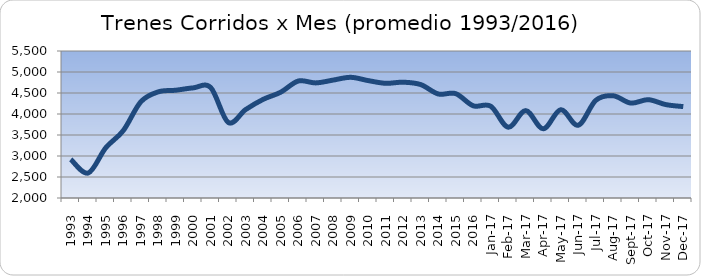
| Category | Series 0 |
|---|---|
| 1993.0 | 2920.333 |
| 1994.0 | 2595.583 |
| 1995.0 | 3195.667 |
| 1996.0 | 3603.833 |
| 1997.0 | 4288.5 |
| 1998.0 | 4527.083 |
| 1999.0 | 4565.833 |
| 2000.0 | 4622.417 |
| 2001.0 | 4628.417 |
| 2002.0 | 3798.583 |
| 2003.0 | 4107.25 |
| 2004.0 | 4349.667 |
| 2005.0 | 4519.333 |
| 2006.0 | 4785.083 |
| 2007.0 | 4740.333 |
| 2008.0 | 4808 |
| 2009.0 | 4873.333 |
| 2010.0 | 4795 |
| 2011.0 | 4730.667 |
| 2012.0 | 4757.167 |
| 2013.0 | 4700.167 |
| 2014.0 | 4477 |
| 2015.0 | 4484.25 |
| 2016.0 | 4194.917 |
| 42736.0 | 4185 |
| 42767.0 | 3686 |
| 42795.0 | 4081 |
| 42826.0 | 3648 |
| 42856.0 | 4102 |
| 42887.0 | 3732 |
| 42917.0 | 4324 |
| 42948.0 | 4434 |
| 42979.0 | 4260 |
| 43009.0 | 4341 |
| 43040.0 | 4224 |
| 43070.0 | 4176 |